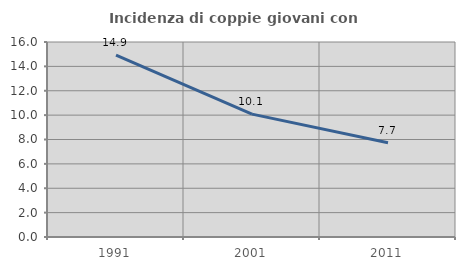
| Category | Incidenza di coppie giovani con figli |
|---|---|
| 1991.0 | 14.915 |
| 2001.0 | 10.083 |
| 2011.0 | 7.74 |